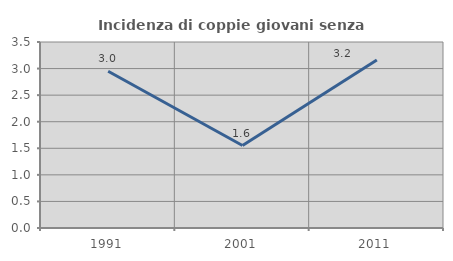
| Category | Incidenza di coppie giovani senza figli |
|---|---|
| 1991.0 | 2.95 |
| 2001.0 | 1.552 |
| 2011.0 | 3.16 |